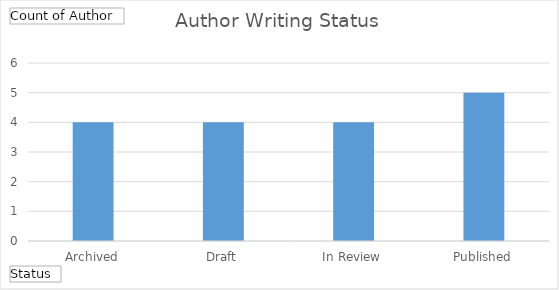
| Category | Total |
|---|---|
| Archived | 4 |
| Draft | 4 |
| In Review | 4 |
| Published | 5 |